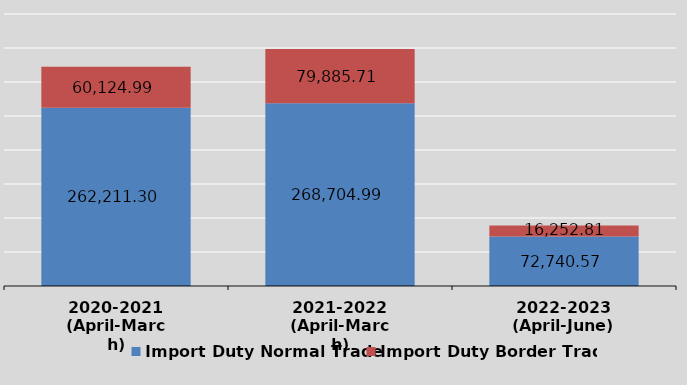
| Category | Import Duty Normal Trade | Import Duty Border Trade |
|---|---|---|
| 2020-2021
(April-March) | 262211.3 | 60124.99 |
| 2021-2022
(April-March) | 268704.987 | 79885.71 |
| 2022-2023
(April-June) | 72740.57 | 16252.806 |